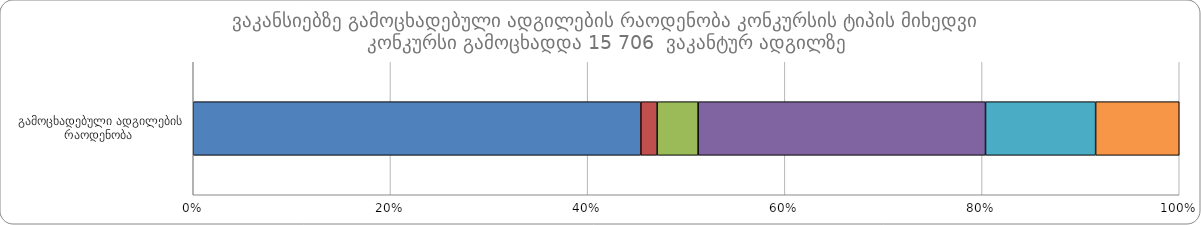
| Category |  ღია კონკურსი |  დახურული კონკურსი |  შიდა კონკურსი |  გამარტივებული კონკურსი |  სტაჟირება |  სხვა |
|---|---|---|---|---|---|---|
|  გამოცხადებული ადგილების რაოდენობა | 7130 | 259 | 653 | 4578 | 1754 | 1332 |